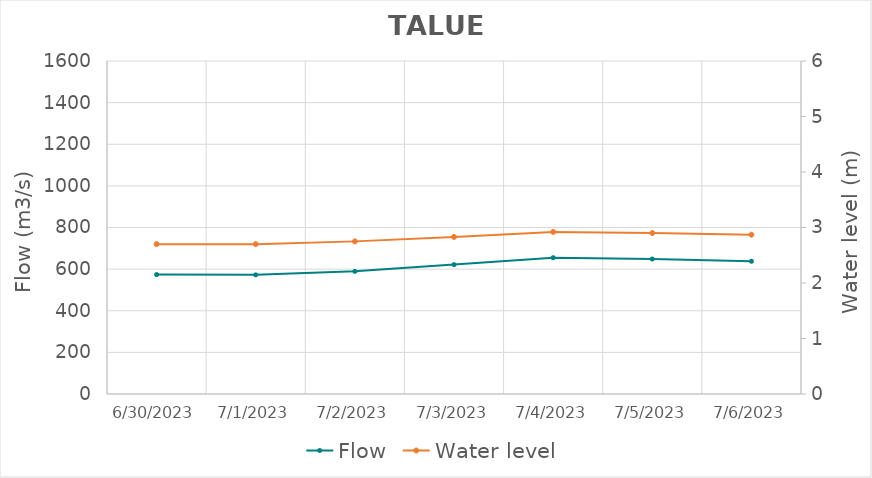
| Category | Flow |
|---|---|
| 4/26/22 | 1550.77 |
| 4/25/22 | 1513.85 |
| 4/24/22 | 1449.65 |
| 4/23/22 | 1390 |
| 4/22/22 | 1337.8 |
| 4/21/22 | 1255.85 |
| 4/20/22 | 1234.26 |